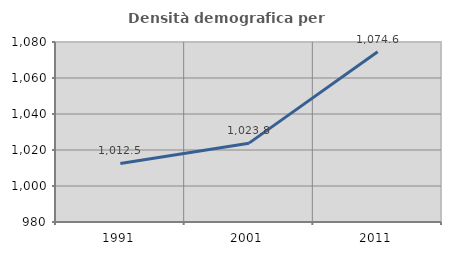
| Category | Densità demografica |
|---|---|
| 1991.0 | 1012.546 |
| 2001.0 | 1023.808 |
| 2011.0 | 1074.608 |